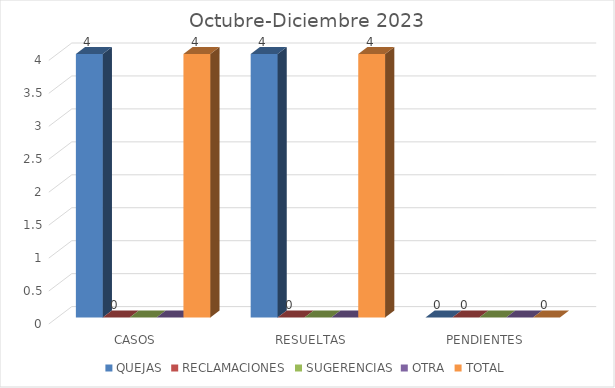
| Category | QUEJAS | RECLAMACIONES | SUGERENCIAS | OTRA | TOTAL |
|---|---|---|---|---|---|
| CASOS | 4 | 0 | 0 | 0 | 4 |
| RESUELTAS | 4 | 0 | 0 | 0 | 4 |
| PENDIENTES | 0 | 0 | 0 | 0 | 0 |